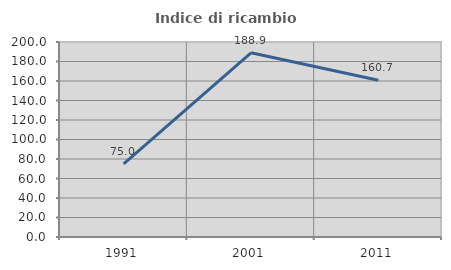
| Category | Indice di ricambio occupazionale  |
|---|---|
| 1991.0 | 75 |
| 2001.0 | 188.889 |
| 2011.0 | 160.714 |